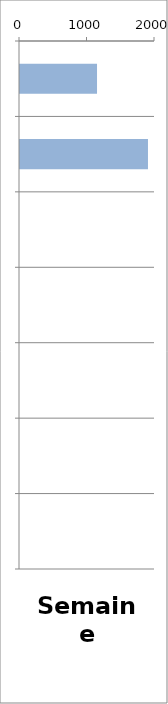
| Category | VL |
|---|---|
| 0 | 1141 |
| 1 | 1896 |
| 2 | 0 |
| 3 | 0 |
| 4 | 0 |
| 5 | 0 |
| 6 | 0 |